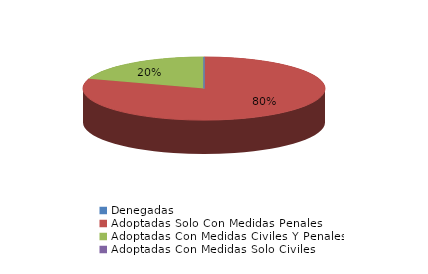
| Category | Series 0 |
|---|---|
| Denegadas | 0 |
| Adoptadas Solo Con Medidas Penales | 4 |
| Adoptadas Con Medidas Civiles Y Penales | 1 |
| Adoptadas Con Medidas Solo Civiles | 0 |